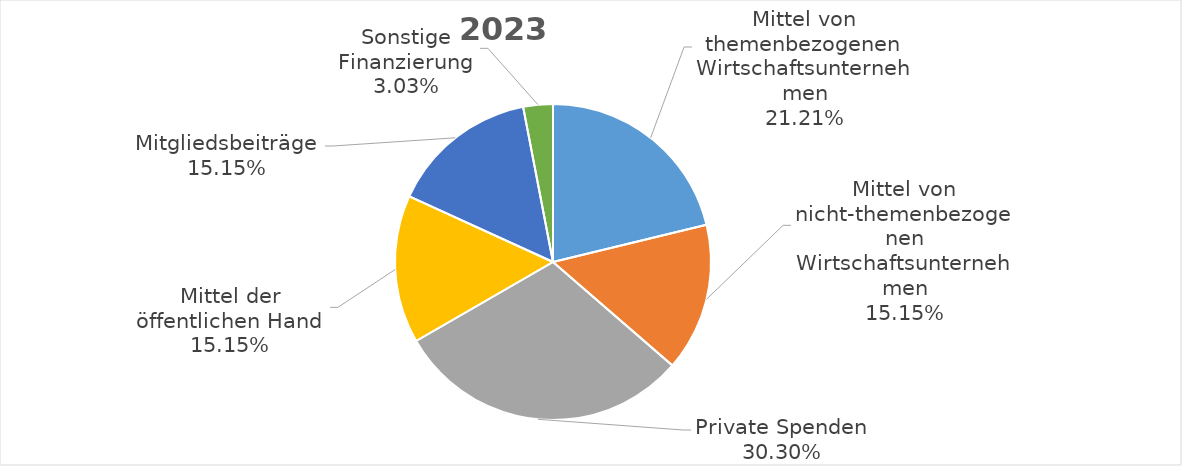
| Category | Series 0 |
|---|---|
| Mittel von themenbezogenen Wirtschaftsunternehmen | 0.212 |
| Mittel von nicht-themenbezogenen Wirtschaftsunternehmen | 0.152 |
| Private Spenden | 0.303 |
| Mittel der öffentlichen Hand | 0.152 |
| Mitgliedsbeiträge | 0.152 |
| Sonstige Finanzierung | 0.03 |